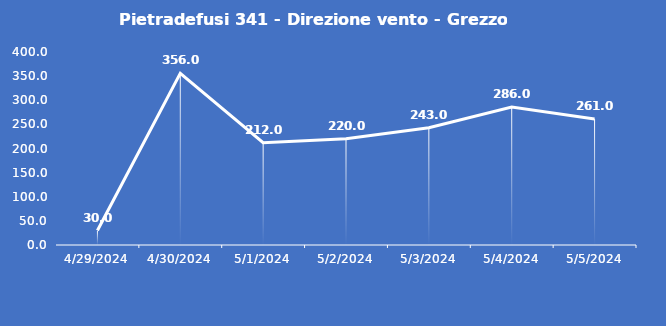
| Category | Pietradefusi 341 - Direzione vento - Grezzo (°N) |
|---|---|
| 4/29/24 | 30 |
| 4/30/24 | 356 |
| 5/1/24 | 212 |
| 5/2/24 | 220 |
| 5/3/24 | 243 |
| 5/4/24 | 286 |
| 5/5/24 | 261 |